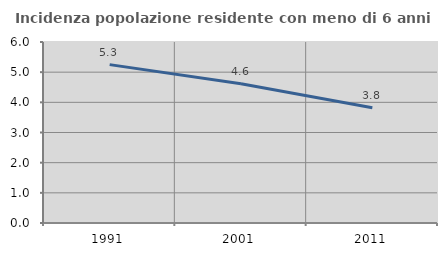
| Category | Incidenza popolazione residente con meno di 6 anni |
|---|---|
| 1991.0 | 5.25 |
| 2001.0 | 4.615 |
| 2011.0 | 3.82 |